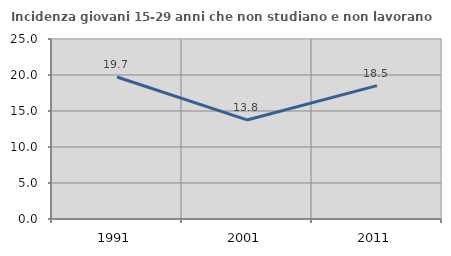
| Category | Incidenza giovani 15-29 anni che non studiano e non lavorano  |
|---|---|
| 1991.0 | 19.72 |
| 2001.0 | 13.76 |
| 2011.0 | 18.519 |